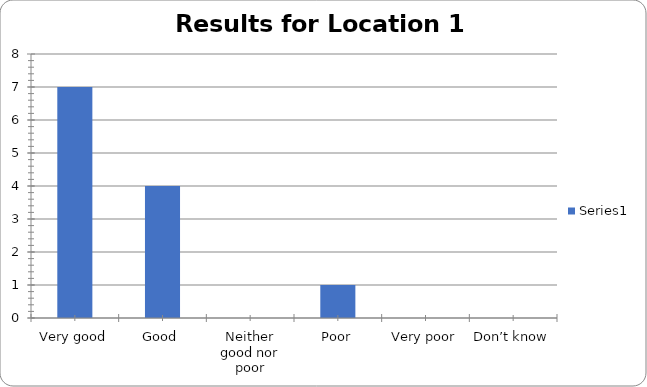
| Category | Series 0 |
|---|---|
| Very good | 7 |
| Good | 4 |
| Neither good nor poor | 0 |
| Poor | 1 |
| Very poor | 0 |
| Don’t know | 0 |